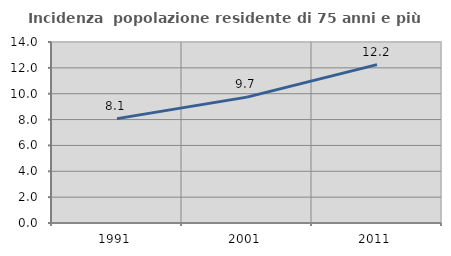
| Category | Incidenza  popolazione residente di 75 anni e più |
|---|---|
| 1991.0 | 8.074 |
| 2001.0 | 9.735 |
| 2011.0 | 12.249 |